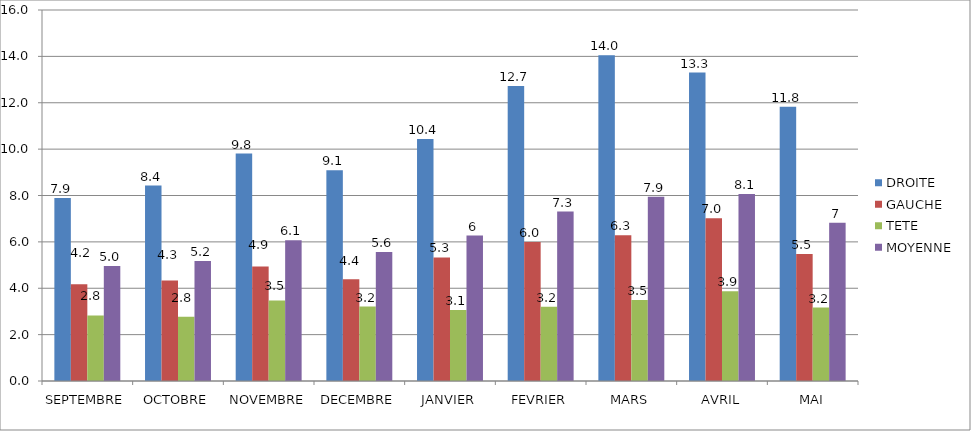
| Category | DROITE | GAUCHE | TETE | MOYENNE |
|---|---|---|---|---|
| SEPTEMBRE | 7.895 | 4.168 | 2.821 | 4.961 |
| OCTOBRE | 8.43 | 4.333 | 2.772 | 5.178 |
| NOVEMBRE | 9.809 | 4.936 | 3.468 | 6.071 |
| DECEMBRE | 9.091 | 4.39 | 3.208 | 5.563 |
| JANVIER | 10.433 | 5.33 | 3.062 | 6.275 |
| FEVRIER | 12.723 | 6 | 3.205 | 7.309 |
| MARS | 14.049 | 6.284 | 3.49 | 7.941 |
| AVRIL | 13.304 | 7.022 | 3.87 | 8.065 |
| MAI | 11.832 | 5.474 | 3.168 | 6.825 |